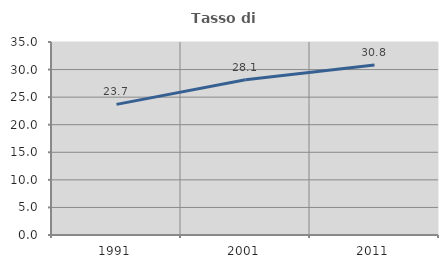
| Category | Tasso di occupazione   |
|---|---|
| 1991.0 | 23.685 |
| 2001.0 | 28.137 |
| 2011.0 | 30.814 |